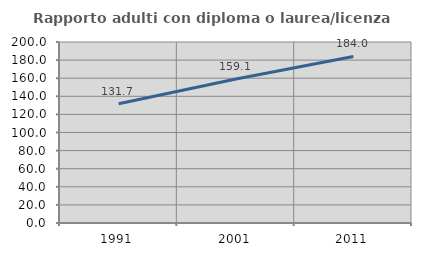
| Category | Rapporto adulti con diploma o laurea/licenza media  |
|---|---|
| 1991.0 | 131.707 |
| 2001.0 | 159.091 |
| 2011.0 | 184 |